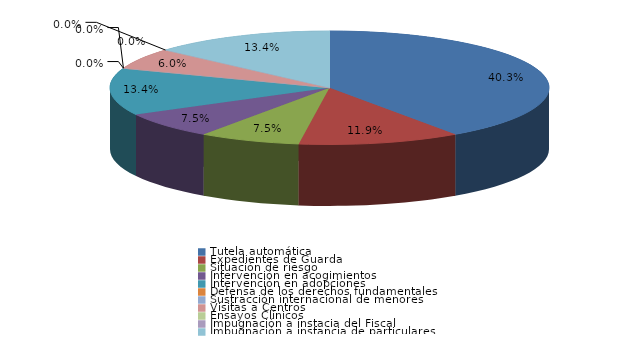
| Category | Series 0 |
|---|---|
| Tutela automática | 27 |
| Expedientes de Guarda | 8 |
| Situación de riesgo | 5 |
| Intervención en acogimientos | 5 |
| Intervención en adopciones | 9 |
| Defensa de los derechos fundamentales | 0 |
| Sustracción internacional de menores | 0 |
| Visitas a Centros | 4 |
| Ensayos Clínicos | 0 |
| Impugnación a instacia del Fiscal | 0 |
| Impugnación a instancia de particulares | 9 |